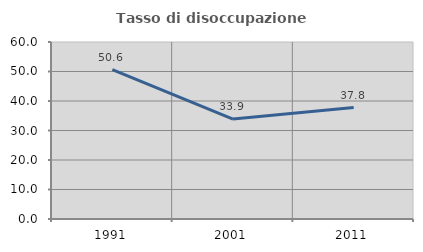
| Category | Tasso di disoccupazione giovanile  |
|---|---|
| 1991.0 | 50.6 |
| 2001.0 | 33.872 |
| 2011.0 | 37.793 |